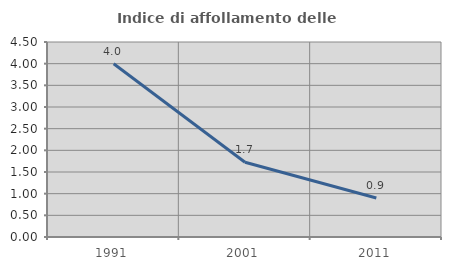
| Category | Indice di affollamento delle abitazioni  |
|---|---|
| 1991.0 | 3.998 |
| 2001.0 | 1.724 |
| 2011.0 | 0.901 |